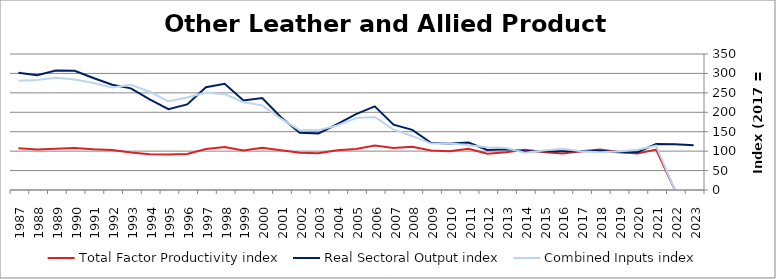
| Category | Total Factor Productivity index | Real Sectoral Output index | Combined Inputs index |
|---|---|---|---|
| 2023.0 | 0 | 115.448 | 0 |
| 2022.0 | 0 | 117.966 | 0 |
| 2021.0 | 104.059 | 118.455 | 113.835 |
| 2020.0 | 93.944 | 97.135 | 103.397 |
| 2019.0 | 97.775 | 97.171 | 99.382 |
| 2018.0 | 104.179 | 100.936 | 96.886 |
| 2017.0 | 100 | 100 | 100 |
| 2016.0 | 93.832 | 99.684 | 106.237 |
| 2015.0 | 97.95 | 99.767 | 101.856 |
| 2014.0 | 103.639 | 99.66 | 96.16 |
| 2013.0 | 96.997 | 104.756 | 108 |
| 2012.0 | 93.54 | 103.204 | 110.332 |
| 2011.0 | 106.138 | 122.071 | 115.012 |
| 2010.0 | 99.533 | 119.86 | 120.422 |
| 2009.0 | 101.598 | 121.334 | 119.425 |
| 2008.0 | 111.317 | 154.9 | 139.152 |
| 2007.0 | 108.072 | 168.035 | 155.483 |
| 2006.0 | 114.513 | 215.206 | 187.932 |
| 2005.0 | 105.571 | 195.304 | 184.998 |
| 2004.0 | 102.06 | 169.449 | 166.028 |
| 2003.0 | 94.569 | 145.729 | 154.099 |
| 2002.0 | 95.775 | 147.281 | 153.778 |
| 2001.0 | 102.138 | 187.403 | 183.48 |
| 2000.0 | 108.724 | 236.903 | 217.895 |
| 1999.0 | 101.956 | 230.298 | 225.879 |
| 1998.0 | 110.793 | 273.195 | 246.581 |
| 1997.0 | 105.435 | 264.515 | 250.88 |
| 1996.0 | 92.453 | 220.185 | 238.159 |
| 1995.0 | 91.059 | 207.842 | 228.249 |
| 1994.0 | 92.247 | 233.201 | 252.802 |
| 1993.0 | 96.525 | 261.49 | 270.902 |
| 1992.0 | 102.734 | 270.782 | 263.576 |
| 1991.0 | 104.736 | 288.181 | 275.151 |
| 1990.0 | 107.98 | 307.033 | 284.342 |
| 1989.0 | 106.364 | 307.511 | 289.112 |
| 1988.0 | 104.343 | 295.369 | 283.074 |
| 1987.0 | 107.289 | 301.6 | 281.109 |